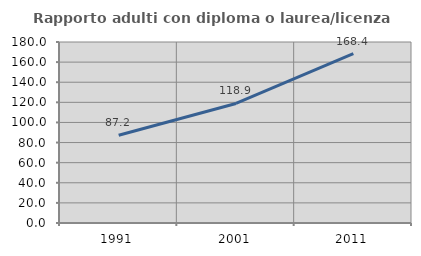
| Category | Rapporto adulti con diploma o laurea/licenza media  |
|---|---|
| 1991.0 | 87.225 |
| 2001.0 | 118.855 |
| 2011.0 | 168.389 |